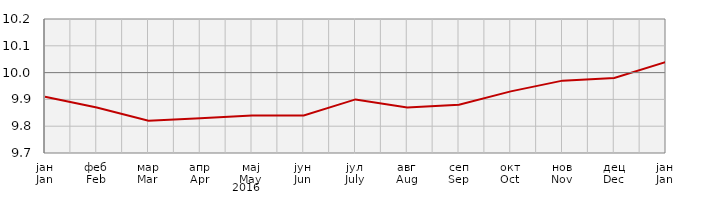
| Category | Индекси потрошачких цијена
Consumer price indices |
|---|---|
| јан
Jan | 99.1 |
| феб
Feb | 98.7 |
| мар
Mar | 98.2 |
| апр
Apr | 98.3 |
| мај
May | 98.4 |
| јун
Jun | 98.4 |
| јул
July | 99 |
| авг
Aug | 98.7 |
| сеп
Sep | 98.8 |
| окт
Oct | 99.3 |
| нов
Nov | 99.7 |
| дец
Dec | 99.8 |
| јан
Jan | 100.4 |